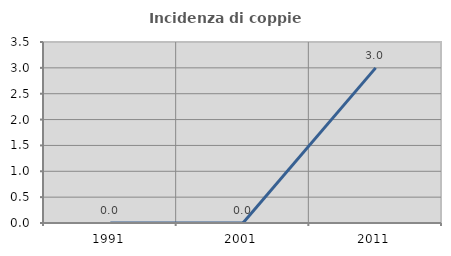
| Category | Incidenza di coppie miste |
|---|---|
| 1991.0 | 0 |
| 2001.0 | 0 |
| 2011.0 | 3 |